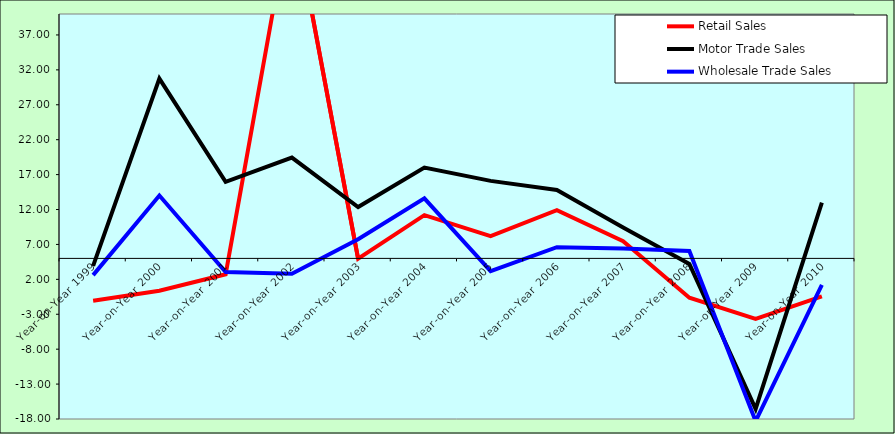
| Category | Retail Sales  | Motor Trade Sales | Wholesale Trade Sales |
|---|---|---|---|
| Year-on-Year 1999 | -1.078 | 3.926 | 2.607 |
| Year-on-Year 2000 | 0.366 | 30.745 | 14.002 |
| Year-on-Year 2001 | 2.729 | 15.974 | 3.059 |
| Year-on-Year 2002 | 55.46 | 19.436 | 2.812 |
| Year-on-Year 2003 | 4.946 | 12.357 | 7.751 |
| Year-on-Year 2004 | 11.189 | 18.014 | 13.601 |
| Year-on-Year 2005 | 8.186 | 16.102 | 3.189 |
| Year-on-Year 2006 | 11.92 | 14.81 | 6.608 |
| Year-on-Year 2007 | 7.463 | 9.422 | 6.409 |
| Year-on-Year 2008 | -0.639 | 4.207 | 6.066 |
| Year-on-Year 2009 | -3.655 | -16.558 | -18.302 |
| Year-on-Year 2010 | -0.436 | 12.989 | 1.224 |